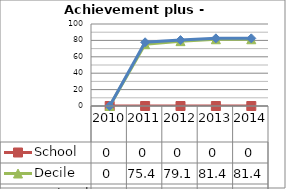
| Category | School  | Decile | National |
|---|---|---|---|
| 2010.0 | 0 | 0 | 0 |
| 2011.0 | 0 | 75.4 | 77.7 |
| 2012.0 | 0 | 79.1 | 80.4 |
| 2013.0 | 0 | 81.4 | 82.5 |
| 2014.0 | 0 | 81.4 | 82.5 |